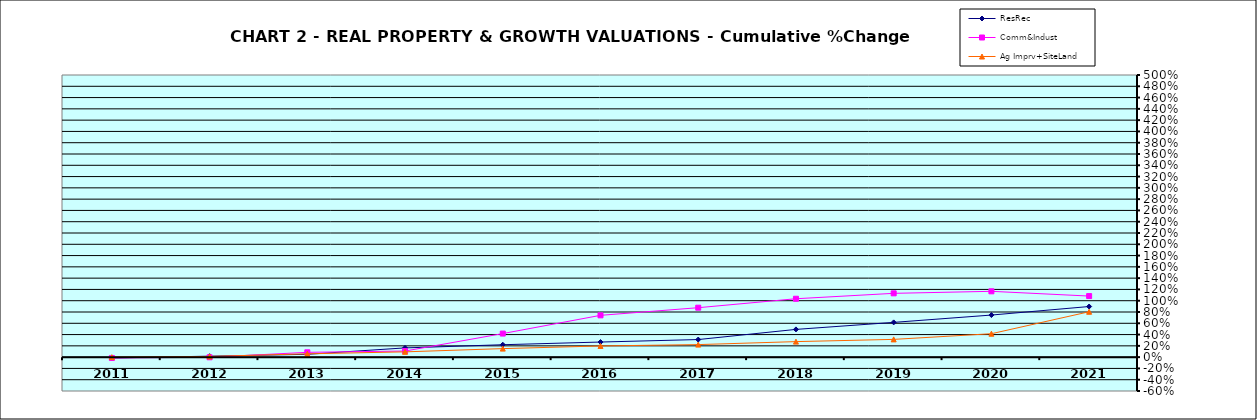
| Category | ResRec | Comm&Indust | Ag Imprv+SiteLand |
|---|---|---|---|
| 2011.0 | -0.015 | -0.014 | 0 |
| 2012.0 | 0.017 | -0.003 | 0.013 |
| 2013.0 | 0.05 | 0.085 | 0.059 |
| 2014.0 | 0.164 | 0.108 | 0.094 |
| 2015.0 | 0.22 | 0.418 | 0.151 |
| 2016.0 | 0.268 | 0.741 | 0.198 |
| 2017.0 | 0.312 | 0.876 | 0.222 |
| 2018.0 | 0.492 | 1.035 | 0.275 |
| 2019.0 | 0.616 | 1.131 | 0.315 |
| 2020.0 | 0.746 | 1.166 | 0.415 |
| 2021.0 | 0.897 | 1.082 | 0.804 |